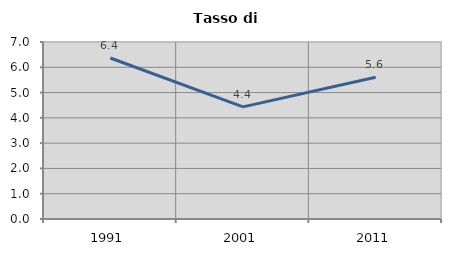
| Category | Tasso di disoccupazione   |
|---|---|
| 1991.0 | 6.368 |
| 2001.0 | 4.435 |
| 2011.0 | 5.603 |